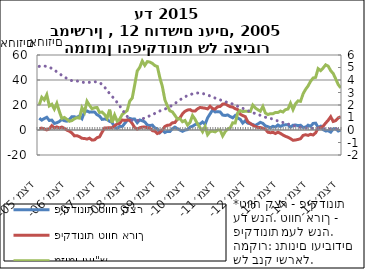
| Category | פיקדונות טווח קצר | פיקדונות טווח ארוך | מזומן ועו"ש |
|---|---|---|---|
| 2005-12-31 | 9.434 | 1.137 | 20.116 |
| 2006-01-31 | 7.9 | 1.502 | 26.183 |
| 2006-02-28 | 9.195 | 0.815 | 24.078 |
| 2006-03-31 | 10.188 | 0.089 | 28.252 |
| 2006-04-30 | 7.624 | 0.939 | 19.271 |
| 2006-05-31 | 7.91 | 3.458 | 20.618 |
| 2006-06-30 | 5.253 | 1.763 | 16.664 |
| 2006-07-31 | 5.816 | 2.487 | 21.342 |
| 2006-08-31 | 6.818 | 1.695 | 14.767 |
| 2006-09-30 | 8.452 | 2.33 | 9.208 |
| 2006-10-31 | 7.372 | 1.312 | 10.024 |
| 2006-11-30 | 7.071 | -0.13 | 8.544 |
| 2006-12-31 | 8.547 | -0.984 | 6.982 |
| 2007-01-31 | 10.655 | -2.396 | 7.555 |
| 2007-02-28 | 10.573 | -4.705 | 8.945 |
| 2007-03-31 | 9.991 | -4.525 | 9.859 |
| 2007-04-30 | 11.288 | -5.37 | 9.488 |
| 2007-05-31 | 9.091 | -6.645 | 17.818 |
| 2007-06-30 | 14.416 | -6.777 | 14.231 |
| 2007-07-31 | 15.265 | -7.277 | 22.968 |
| 2007-08-31 | 14.286 | -6.521 | 19.726 |
| 2007-09-30 | 14.494 | -8.074 | 17 |
| 2007-10-31 | 14.306 | -7.882 | 17.831 |
| 2007-11-30 | 12.248 | -6.138 | 18.009 |
| 2007-12-31 | 11.102 | -5.496 | 14.052 |
| 2008-01-31 | 8.482 | -1.762 | 14.369 |
| 2008-02-29 | 8.752 | 1.536 | 12.418 |
| 2008-03-31 | 8.477 | 1.662 | 9.399 |
| 2008-04-30 | 6.907 | 1.883 | 16.274 |
| 2008-05-31 | 6.13 | 1.691 | 6.096 |
| 2008-06-30 | 2.256 | 3.402 | 12.01 |
| 2008-07-31 | 1.269 | 4.848 | 7.13 |
| 2008-08-31 | 2.944 | 5.276 | 8.554 |
| 2008-09-30 | 2.626 | 8.027 | 12.389 |
| 2008-10-31 | 5.254 | 7.682 | 14.009 |
| 2008-11-30 | 7.668 | 7.997 | 15.576 |
| 2008-12-31 | 9.32 | 7.765 | 23.04 |
| 2009-01-31 | 8.69 | 5.214 | 25.502 |
| 2009-02-28 | 8.721 | 1.912 | 36.119 |
| 2009-03-31 | 5.857 | 0.669 | 47.234 |
| 2009-04-30 | 8 | 1.832 | 50.119 |
| 2009-05-31 | 7.386 | 2.282 | 55.207 |
| 2009-06-30 | 6.473 | 2.433 | 51.726 |
| 2009-07-31 | 4.009 | 1.724 | 54.7 |
| 2009-08-31 | 3.555 | 1.566 | 54.385 |
| 2009-09-30 | 3.905 | -0.526 | 53.326 |
| 2009-10-31 | 1.667 | -0.917 | 51.558 |
| 2009-11-30 | 0.944 | -2.857 | 50.748 |
| 2009-12-31 | -2.039 | -1.939 | 41.833 |
| 2010-01-31 | -0.043 | 0.084 | 34.822 |
| 2010-02-28 | -1.993 | 2.823 | 24.163 |
| 2010-03-31 | -1.076 | 3.775 | 19.165 |
| 2010-04-30 | -1.21 | 4.004 | 15.33 |
| 2010-05-31 | 1.06 | 5.79 | 14.508 |
| 2010-06-30 | 2.284 | 5.984 | 11.704 |
| 2010-07-31 | 1.064 | 8.643 | 8.735 |
| 2010-08-31 | -0.04 | 9.619 | 9.115 |
| 2010-09-30 | -1.079 | 12.925 | 6.624 |
| 2010-10-31 | -0.05 | 14.893 | 7.6 |
| 2010-11-30 | 0.309 | 15.994 | 3.976 |
| 2010-12-31 | 2.275 | 16.296 | 6.019 |
| 2011-01-31 | 2.955 | 15.125 | 11.534 |
| 2011-02-28 | 4.326 | 15.113 | 8.653 |
| 2011-03-31 | 4.85 | 16.907 | 4.804 |
| 2011-04-30 | 4.786 | 18.042 | 1.906 |
| 2011-05-31 | 6.453 | 17.743 | -1.397 |
| 2011-06-30 | 4.468 | 17.43 | 2.774 |
| 2011-07-31 | 9.709 | 16.884 | -3.753 |
| 2011-08-31 | 12.874 | 18.989 | -1.262 |
| 2011-09-30 | 16.064 | 17.071 | -0.942 |
| 2011-10-31 | 14.47 | 16.764 | -1.505 |
| 2011-11-30 | 14.629 | 18.573 | -0.009 |
| 2011-12-31 | 14.458 | 18.833 | 0.001 |
| 2012-01-31 | 11.947 | 20.699 | -4.768 |
| 2012-02-29 | 11.608 | 20.974 | -1.369 |
| 2012-03-31 | 12.071 | 19.65 | 0.723 |
| 2012-04-30 | 10.747 | 18.659 | 1.681 |
| 2012-05-31 | 9.736 | 18.316 | 5.752 |
| 2012-06-30 | 11.607 | 17.017 | 5.582 |
| 2012-07-31 | 9.506 | 16.338 | 13.713 |
| 2012-08-31 | 8.544 | 12.636 | 15.51 |
| 2012-09-30 | 5.566 | 11.528 | 14.733 |
| 2012-10-31 | 7.37 | 10.713 | 15.005 |
| 2012-11-30 | 5.465 | 6.599 | 14.887 |
| 2012-12-31 | 4.952 | 5.24 | 14.746 |
| 2013-01-31 | 4.386 | 3.846 | 19.923 |
| 2013-02-28 | 3.573 | 2.874 | 17.632 |
| 2013-03-31 | 4.814 | 1.961 | 16.241 |
| 2013-04-30 | 6.124 | 1.966 | 15.044 |
| 2013-05-31 | 5.321 | 1.4 | 18.796 |
| 2013-06-30 | 3.325 | 0.654 | 13.601 |
| 2013-07-31 | 2.676 | -1.77 | 12.348 |
| 2013-08-31 | 1.802 | -2.184 | 13.067 |
| 2013-09-30 | 2.93 | -1.86 | 13.051 |
| 2013-10-31 | 2.346 | -2.825 | 14.054 |
| 2013-11-30 | 4.009 | -1.761 | 13.968 |
| 2013-12-31 | 2.781 | -2.715 | 15.161 |
| 2014-01-31 | 3.81 | -3.999 | 14.381 |
| 2014-02-28 | 4.14 | -5.055 | 16.265 |
| 2014-03-31 | 4.217 | -5.804 | 16.773 |
| 2014-04-30 | 2.249 | -6.921 | 21.398 |
| 2014-05-31 | 3.814 | -8.223 | 16.315 |
| 2014-06-30 | 3.985 | -7.998 | 20.982 |
| 2014-07-31 | 3.503 | -7.544 | 23.292 |
| 2014-08-31 | 3.766 | -6.978 | 22.906 |
| 2014-09-30 | 2.076 | -4.333 | 28.914 |
| 2014-10-31 | 2.137 | -3.799 | 32.484 |
| 2014-11-30 | 3.844 | -4.303 | 35.231 |
| 2014-12-31 | 2.929 | -3.449 | 39.011 |
| 2015-01-31 | 5.245 | -4.002 | 41.579 |
| 2015-02-28 | 5.485 | -2.259 | 42.094 |
| 2015-03-31 | 2.062 | 1.471 | 49.071 |
| 2015-04-30 | 3.053 | 1.802 | 47.494 |
| 2015-05-31 | 0.303 | 3.067 | 49.624 |
| 2015-06-30 | -0.774 | 5.551 | 52.134 |
| 2015-07-31 | -0.569 | 7.808 | 51.085 |
| 2015-08-31 | -1.718 | 10.621 | 47.454 |
| 2015-09-30 | 0.849 | 6.831 | 45.156 |
| 2015-10-31 | 1.019 | 7.527 | 40.871 |
| 2015-11-30 | -0.834 | 9.688 | 36.338 |
| 2015-12-31 | -0.012 | 10.555 | 33.664 |